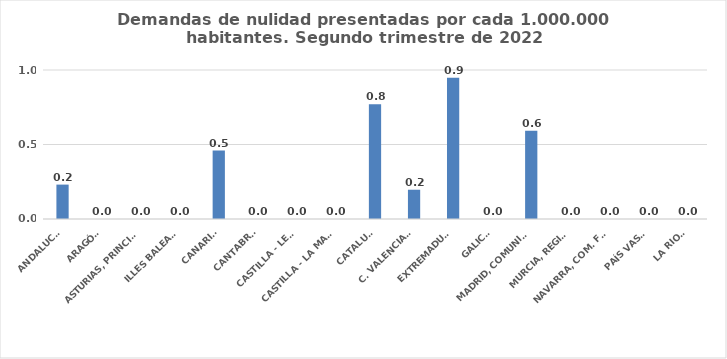
| Category | Series 0 |
|---|---|
| ANDALUCÍA | 0.231 |
| ARAGÓN | 0 |
| ASTURIAS, PRINCIPADO | 0 |
| ILLES BALEARS | 0 |
| CANARIAS | 0.459 |
| CANTABRIA | 0 |
| CASTILLA - LEÓN | 0 |
| CASTILLA - LA MANCHA | 0 |
| CATALUÑA | 0.771 |
| C. VALENCIANA | 0.196 |
| EXTREMADURA | 0.949 |
| GALICIA | 0 |
| MADRID, COMUNIDAD | 0.593 |
| MURCIA, REGIÓN | 0 |
| NAVARRA, COM. FORAL | 0 |
| PAÍS VASCO | 0 |
| LA RIOJA | 0 |